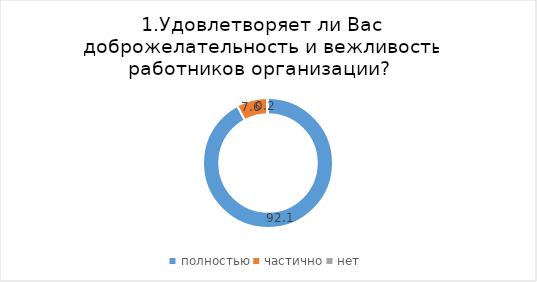
| Category | Томский |
|---|---|
| полностью | 92.146 |
| частично | 7.607 |
| нет | 0.247 |